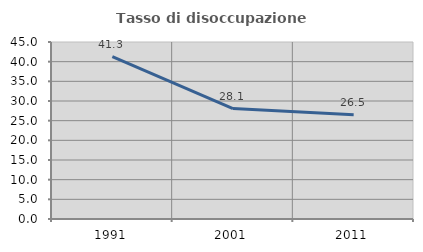
| Category | Tasso di disoccupazione giovanile  |
|---|---|
| 1991.0 | 41.275 |
| 2001.0 | 28.063 |
| 2011.0 | 26.514 |